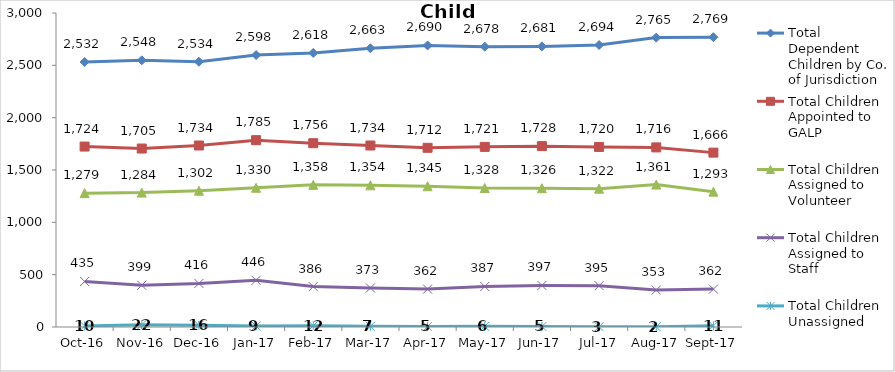
| Category | Total Dependent Children by Co. of Jurisdiction | Total Children Appointed to GALP | Total Children Assigned to Volunteer | Total Children Assigned to Staff | Total Children Unassigned |
|---|---|---|---|---|---|
| 2016-10-01 | 2532 | 1724 | 1279 | 435 | 10 |
| 2016-11-01 | 2548 | 1705 | 1284 | 399 | 22 |
| 2016-12-01 | 2534 | 1734 | 1302 | 416 | 16 |
| 2017-01-01 | 2598 | 1785 | 1330 | 446 | 9 |
| 2017-02-01 | 2618 | 1756 | 1358 | 386 | 12 |
| 2017-03-01 | 2663 | 1734 | 1354 | 373 | 7 |
| 2017-04-01 | 2690 | 1712 | 1345 | 362 | 5 |
| 2017-05-01 | 2678 | 1721 | 1328 | 387 | 6 |
| 2017-06-01 | 2681 | 1728 | 1326 | 397 | 5 |
| 2017-07-01 | 2694 | 1720 | 1322 | 395 | 3 |
| 2017-08-01 | 2765 | 1716 | 1361 | 353 | 2 |
| 2017-09-01 | 2769 | 1666 | 1293 | 362 | 11 |